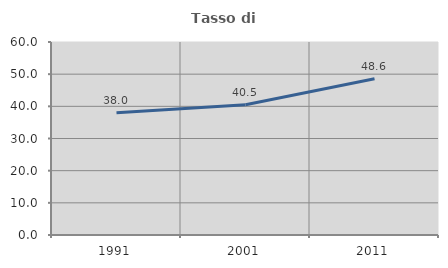
| Category | Tasso di occupazione   |
|---|---|
| 1991.0 | 38.028 |
| 2001.0 | 40.496 |
| 2011.0 | 48.571 |